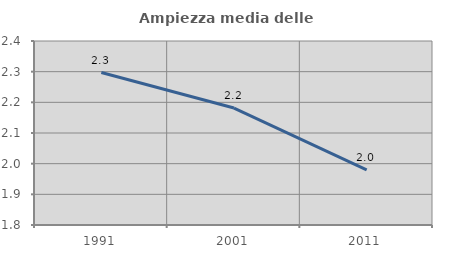
| Category | Ampiezza media delle famiglie |
|---|---|
| 1991.0 | 2.297 |
| 2001.0 | 2.181 |
| 2011.0 | 1.98 |